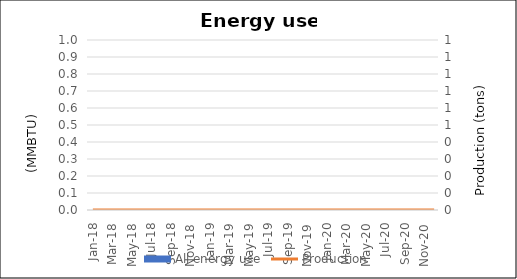
| Category | All energy use |
|---|---|
| Jan-18 | 0 |
| Feb-18 | 0 |
| Mar-18 | 0 |
| Apr-18 | 0 |
| May-18 | 0 |
| Jun-18 | 0 |
| Jul-18 | 0 |
| Aug-18 | 0 |
| Sep-18 | 0 |
| Oct-18 | 0 |
| Nov-18 | 0 |
| Dec-18 | 0 |
| Jan-19 | 0 |
| Feb-19 | 0 |
| Mar-19 | 0 |
| Apr-19 | 0 |
| May-19 | 0 |
| Jun-19 | 0 |
| Jul-19 | 0 |
| Aug-19 | 0 |
| Sep-19 | 0 |
| Oct-19 | 0 |
| Nov-19 | 0 |
| Dec-19 | 0 |
| Jan-20 | 0 |
| Feb-20 | 0 |
| Mar-20 | 0 |
| Apr-20 | 0 |
| May-20 | 0 |
| Jun-20 | 0 |
| Jul-20 | 0 |
| Aug-20 | 0 |
| Sep-20 | 0 |
| Oct-20 | 0 |
| Nov-20 | 0 |
| Dec-20 | 0 |